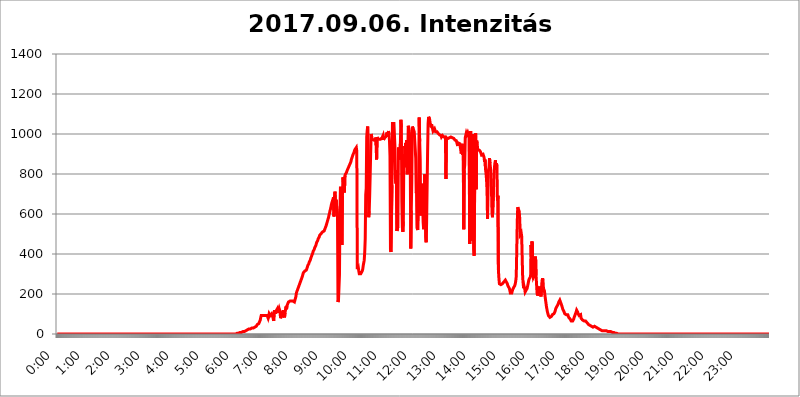
| Category | 2017.09.06. Intenzitás [W/m^2] |
|---|---|
| 0.0 | 0 |
| 0.0006944444444444445 | 0 |
| 0.001388888888888889 | 0 |
| 0.0020833333333333333 | 0 |
| 0.002777777777777778 | 0 |
| 0.003472222222222222 | 0 |
| 0.004166666666666667 | 0 |
| 0.004861111111111111 | 0 |
| 0.005555555555555556 | 0 |
| 0.0062499999999999995 | 0 |
| 0.006944444444444444 | 0 |
| 0.007638888888888889 | 0 |
| 0.008333333333333333 | 0 |
| 0.009027777777777779 | 0 |
| 0.009722222222222222 | 0 |
| 0.010416666666666666 | 0 |
| 0.011111111111111112 | 0 |
| 0.011805555555555555 | 0 |
| 0.012499999999999999 | 0 |
| 0.013194444444444444 | 0 |
| 0.013888888888888888 | 0 |
| 0.014583333333333332 | 0 |
| 0.015277777777777777 | 0 |
| 0.015972222222222224 | 0 |
| 0.016666666666666666 | 0 |
| 0.017361111111111112 | 0 |
| 0.018055555555555557 | 0 |
| 0.01875 | 0 |
| 0.019444444444444445 | 0 |
| 0.02013888888888889 | 0 |
| 0.020833333333333332 | 0 |
| 0.02152777777777778 | 0 |
| 0.022222222222222223 | 0 |
| 0.02291666666666667 | 0 |
| 0.02361111111111111 | 0 |
| 0.024305555555555556 | 0 |
| 0.024999999999999998 | 0 |
| 0.025694444444444447 | 0 |
| 0.02638888888888889 | 0 |
| 0.027083333333333334 | 0 |
| 0.027777777777777776 | 0 |
| 0.02847222222222222 | 0 |
| 0.029166666666666664 | 0 |
| 0.029861111111111113 | 0 |
| 0.030555555555555555 | 0 |
| 0.03125 | 0 |
| 0.03194444444444445 | 0 |
| 0.03263888888888889 | 0 |
| 0.03333333333333333 | 0 |
| 0.034027777777777775 | 0 |
| 0.034722222222222224 | 0 |
| 0.035416666666666666 | 0 |
| 0.036111111111111115 | 0 |
| 0.03680555555555556 | 0 |
| 0.0375 | 0 |
| 0.03819444444444444 | 0 |
| 0.03888888888888889 | 0 |
| 0.03958333333333333 | 0 |
| 0.04027777777777778 | 0 |
| 0.04097222222222222 | 0 |
| 0.041666666666666664 | 0 |
| 0.042361111111111106 | 0 |
| 0.04305555555555556 | 0 |
| 0.043750000000000004 | 0 |
| 0.044444444444444446 | 0 |
| 0.04513888888888889 | 0 |
| 0.04583333333333334 | 0 |
| 0.04652777777777778 | 0 |
| 0.04722222222222222 | 0 |
| 0.04791666666666666 | 0 |
| 0.04861111111111111 | 0 |
| 0.049305555555555554 | 0 |
| 0.049999999999999996 | 0 |
| 0.05069444444444445 | 0 |
| 0.051388888888888894 | 0 |
| 0.052083333333333336 | 0 |
| 0.05277777777777778 | 0 |
| 0.05347222222222222 | 0 |
| 0.05416666666666667 | 0 |
| 0.05486111111111111 | 0 |
| 0.05555555555555555 | 0 |
| 0.05625 | 0 |
| 0.05694444444444444 | 0 |
| 0.057638888888888885 | 0 |
| 0.05833333333333333 | 0 |
| 0.05902777777777778 | 0 |
| 0.059722222222222225 | 0 |
| 0.06041666666666667 | 0 |
| 0.061111111111111116 | 0 |
| 0.06180555555555556 | 0 |
| 0.0625 | 0 |
| 0.06319444444444444 | 0 |
| 0.06388888888888888 | 0 |
| 0.06458333333333334 | 0 |
| 0.06527777777777778 | 0 |
| 0.06597222222222222 | 0 |
| 0.06666666666666667 | 0 |
| 0.06736111111111111 | 0 |
| 0.06805555555555555 | 0 |
| 0.06874999999999999 | 0 |
| 0.06944444444444443 | 0 |
| 0.07013888888888889 | 0 |
| 0.07083333333333333 | 0 |
| 0.07152777777777779 | 0 |
| 0.07222222222222223 | 0 |
| 0.07291666666666667 | 0 |
| 0.07361111111111111 | 0 |
| 0.07430555555555556 | 0 |
| 0.075 | 0 |
| 0.07569444444444444 | 0 |
| 0.0763888888888889 | 0 |
| 0.07708333333333334 | 0 |
| 0.07777777777777778 | 0 |
| 0.07847222222222222 | 0 |
| 0.07916666666666666 | 0 |
| 0.0798611111111111 | 0 |
| 0.08055555555555556 | 0 |
| 0.08125 | 0 |
| 0.08194444444444444 | 0 |
| 0.08263888888888889 | 0 |
| 0.08333333333333333 | 0 |
| 0.08402777777777777 | 0 |
| 0.08472222222222221 | 0 |
| 0.08541666666666665 | 0 |
| 0.08611111111111112 | 0 |
| 0.08680555555555557 | 0 |
| 0.08750000000000001 | 0 |
| 0.08819444444444445 | 0 |
| 0.08888888888888889 | 0 |
| 0.08958333333333333 | 0 |
| 0.09027777777777778 | 0 |
| 0.09097222222222222 | 0 |
| 0.09166666666666667 | 0 |
| 0.09236111111111112 | 0 |
| 0.09305555555555556 | 0 |
| 0.09375 | 0 |
| 0.09444444444444444 | 0 |
| 0.09513888888888888 | 0 |
| 0.09583333333333333 | 0 |
| 0.09652777777777777 | 0 |
| 0.09722222222222222 | 0 |
| 0.09791666666666667 | 0 |
| 0.09861111111111111 | 0 |
| 0.09930555555555555 | 0 |
| 0.09999999999999999 | 0 |
| 0.10069444444444443 | 0 |
| 0.1013888888888889 | 0 |
| 0.10208333333333335 | 0 |
| 0.10277777777777779 | 0 |
| 0.10347222222222223 | 0 |
| 0.10416666666666667 | 0 |
| 0.10486111111111111 | 0 |
| 0.10555555555555556 | 0 |
| 0.10625 | 0 |
| 0.10694444444444444 | 0 |
| 0.1076388888888889 | 0 |
| 0.10833333333333334 | 0 |
| 0.10902777777777778 | 0 |
| 0.10972222222222222 | 0 |
| 0.1111111111111111 | 0 |
| 0.11180555555555556 | 0 |
| 0.11180555555555556 | 0 |
| 0.1125 | 0 |
| 0.11319444444444444 | 0 |
| 0.11388888888888889 | 0 |
| 0.11458333333333333 | 0 |
| 0.11527777777777777 | 0 |
| 0.11597222222222221 | 0 |
| 0.11666666666666665 | 0 |
| 0.1173611111111111 | 0 |
| 0.11805555555555557 | 0 |
| 0.11944444444444445 | 0 |
| 0.12013888888888889 | 0 |
| 0.12083333333333333 | 0 |
| 0.12152777777777778 | 0 |
| 0.12222222222222223 | 0 |
| 0.12291666666666667 | 0 |
| 0.12291666666666667 | 0 |
| 0.12361111111111112 | 0 |
| 0.12430555555555556 | 0 |
| 0.125 | 0 |
| 0.12569444444444444 | 0 |
| 0.12638888888888888 | 0 |
| 0.12708333333333333 | 0 |
| 0.16875 | 0 |
| 0.12847222222222224 | 0 |
| 0.12916666666666668 | 0 |
| 0.12986111111111112 | 0 |
| 0.13055555555555556 | 0 |
| 0.13125 | 0 |
| 0.13194444444444445 | 0 |
| 0.1326388888888889 | 0 |
| 0.13333333333333333 | 0 |
| 0.13402777777777777 | 0 |
| 0.13402777777777777 | 0 |
| 0.13472222222222222 | 0 |
| 0.13541666666666666 | 0 |
| 0.1361111111111111 | 0 |
| 0.13749999999999998 | 0 |
| 0.13819444444444443 | 0 |
| 0.1388888888888889 | 0 |
| 0.13958333333333334 | 0 |
| 0.14027777777777778 | 0 |
| 0.14097222222222222 | 0 |
| 0.14166666666666666 | 0 |
| 0.1423611111111111 | 0 |
| 0.14305555555555557 | 0 |
| 0.14375000000000002 | 0 |
| 0.14444444444444446 | 0 |
| 0.1451388888888889 | 0 |
| 0.1451388888888889 | 0 |
| 0.14652777777777778 | 0 |
| 0.14722222222222223 | 0 |
| 0.14791666666666667 | 0 |
| 0.1486111111111111 | 0 |
| 0.14930555555555555 | 0 |
| 0.15 | 0 |
| 0.15069444444444444 | 0 |
| 0.15138888888888888 | 0 |
| 0.15208333333333332 | 0 |
| 0.15277777777777776 | 0 |
| 0.15347222222222223 | 0 |
| 0.15416666666666667 | 0 |
| 0.15486111111111112 | 0 |
| 0.15555555555555556 | 0 |
| 0.15625 | 0 |
| 0.15694444444444444 | 0 |
| 0.15763888888888888 | 0 |
| 0.15833333333333333 | 0 |
| 0.15902777777777777 | 0 |
| 0.15972222222222224 | 0 |
| 0.16041666666666668 | 0 |
| 0.16111111111111112 | 0 |
| 0.16180555555555556 | 0 |
| 0.1625 | 0 |
| 0.16319444444444445 | 0 |
| 0.1638888888888889 | 0 |
| 0.16458333333333333 | 0 |
| 0.16527777777777777 | 0 |
| 0.16597222222222222 | 0 |
| 0.16666666666666666 | 0 |
| 0.1673611111111111 | 0 |
| 0.16805555555555554 | 0 |
| 0.16874999999999998 | 0 |
| 0.16944444444444443 | 0 |
| 0.17013888888888887 | 0 |
| 0.1708333333333333 | 0 |
| 0.17152777777777775 | 0 |
| 0.17222222222222225 | 0 |
| 0.1729166666666667 | 0 |
| 0.17361111111111113 | 0 |
| 0.17430555555555557 | 0 |
| 0.17500000000000002 | 0 |
| 0.17569444444444446 | 0 |
| 0.1763888888888889 | 0 |
| 0.17708333333333334 | 0 |
| 0.17777777777777778 | 0 |
| 0.17847222222222223 | 0 |
| 0.17916666666666667 | 0 |
| 0.1798611111111111 | 0 |
| 0.18055555555555555 | 0 |
| 0.18125 | 0 |
| 0.18194444444444444 | 0 |
| 0.1826388888888889 | 0 |
| 0.18333333333333335 | 0 |
| 0.1840277777777778 | 0 |
| 0.18472222222222223 | 0 |
| 0.18541666666666667 | 0 |
| 0.18611111111111112 | 0 |
| 0.18680555555555556 | 0 |
| 0.1875 | 0 |
| 0.18819444444444444 | 0 |
| 0.18888888888888888 | 0 |
| 0.18958333333333333 | 0 |
| 0.19027777777777777 | 0 |
| 0.1909722222222222 | 0 |
| 0.19166666666666665 | 0 |
| 0.19236111111111112 | 0 |
| 0.19305555555555554 | 0 |
| 0.19375 | 0 |
| 0.19444444444444445 | 0 |
| 0.1951388888888889 | 0 |
| 0.19583333333333333 | 0 |
| 0.19652777777777777 | 0 |
| 0.19722222222222222 | 0 |
| 0.19791666666666666 | 0 |
| 0.1986111111111111 | 0 |
| 0.19930555555555554 | 0 |
| 0.19999999999999998 | 0 |
| 0.20069444444444443 | 0 |
| 0.20138888888888887 | 0 |
| 0.2020833333333333 | 0 |
| 0.2027777777777778 | 0 |
| 0.2034722222222222 | 0 |
| 0.2041666666666667 | 0 |
| 0.20486111111111113 | 0 |
| 0.20555555555555557 | 0 |
| 0.20625000000000002 | 0 |
| 0.20694444444444446 | 0 |
| 0.2076388888888889 | 0 |
| 0.20833333333333334 | 0 |
| 0.20902777777777778 | 0 |
| 0.20972222222222223 | 0 |
| 0.21041666666666667 | 0 |
| 0.2111111111111111 | 0 |
| 0.21180555555555555 | 0 |
| 0.2125 | 0 |
| 0.21319444444444444 | 0 |
| 0.2138888888888889 | 0 |
| 0.21458333333333335 | 0 |
| 0.2152777777777778 | 0 |
| 0.21597222222222223 | 0 |
| 0.21666666666666667 | 0 |
| 0.21736111111111112 | 0 |
| 0.21805555555555556 | 0 |
| 0.21875 | 0 |
| 0.21944444444444444 | 0 |
| 0.22013888888888888 | 0 |
| 0.22083333333333333 | 0 |
| 0.22152777777777777 | 0 |
| 0.2222222222222222 | 0 |
| 0.22291666666666665 | 0 |
| 0.2236111111111111 | 0 |
| 0.22430555555555556 | 0 |
| 0.225 | 0 |
| 0.22569444444444445 | 0 |
| 0.2263888888888889 | 0 |
| 0.22708333333333333 | 0 |
| 0.22777777777777777 | 0 |
| 0.22847222222222222 | 0 |
| 0.22916666666666666 | 0 |
| 0.2298611111111111 | 0 |
| 0.23055555555555554 | 0 |
| 0.23124999999999998 | 0 |
| 0.23194444444444443 | 0 |
| 0.23263888888888887 | 0 |
| 0.2333333333333333 | 0 |
| 0.2340277777777778 | 0 |
| 0.2347222222222222 | 0 |
| 0.2354166666666667 | 0 |
| 0.23611111111111113 | 0 |
| 0.23680555555555557 | 0 |
| 0.23750000000000002 | 0 |
| 0.23819444444444446 | 0 |
| 0.2388888888888889 | 0 |
| 0.23958333333333334 | 0 |
| 0.24027777777777778 | 0 |
| 0.24097222222222223 | 0 |
| 0.24166666666666667 | 0 |
| 0.2423611111111111 | 0 |
| 0.24305555555555555 | 0 |
| 0.24375 | 0 |
| 0.24444444444444446 | 0 |
| 0.24513888888888888 | 0 |
| 0.24583333333333335 | 0 |
| 0.2465277777777778 | 0 |
| 0.24722222222222223 | 0 |
| 0.24791666666666667 | 0 |
| 0.24861111111111112 | 0 |
| 0.24930555555555556 | 0 |
| 0.25 | 0 |
| 0.25069444444444444 | 3.525 |
| 0.2513888888888889 | 3.525 |
| 0.2520833333333333 | 3.525 |
| 0.25277777777777777 | 3.525 |
| 0.2534722222222222 | 3.525 |
| 0.25416666666666665 | 3.525 |
| 0.2548611111111111 | 3.525 |
| 0.2555555555555556 | 3.525 |
| 0.25625000000000003 | 7.887 |
| 0.2569444444444445 | 7.887 |
| 0.2576388888888889 | 7.887 |
| 0.25833333333333336 | 7.887 |
| 0.2590277777777778 | 7.887 |
| 0.25972222222222224 | 12.257 |
| 0.2604166666666667 | 12.257 |
| 0.2611111111111111 | 12.257 |
| 0.26180555555555557 | 12.257 |
| 0.2625 | 12.257 |
| 0.26319444444444445 | 16.636 |
| 0.2638888888888889 | 16.636 |
| 0.26458333333333334 | 16.636 |
| 0.2652777777777778 | 21.024 |
| 0.2659722222222222 | 21.024 |
| 0.26666666666666666 | 21.024 |
| 0.2673611111111111 | 21.024 |
| 0.26805555555555555 | 25.419 |
| 0.26875 | 25.419 |
| 0.26944444444444443 | 25.419 |
| 0.2701388888888889 | 25.419 |
| 0.2708333333333333 | 25.419 |
| 0.27152777777777776 | 25.419 |
| 0.2722222222222222 | 29.823 |
| 0.27291666666666664 | 29.823 |
| 0.2736111111111111 | 29.823 |
| 0.2743055555555555 | 29.823 |
| 0.27499999999999997 | 29.823 |
| 0.27569444444444446 | 34.234 |
| 0.27638888888888885 | 34.234 |
| 0.27708333333333335 | 34.234 |
| 0.2777777777777778 | 38.653 |
| 0.27847222222222223 | 38.653 |
| 0.2791666666666667 | 38.653 |
| 0.2798611111111111 | 43.079 |
| 0.28055555555555556 | 47.511 |
| 0.28125 | 47.511 |
| 0.28194444444444444 | 47.511 |
| 0.2826388888888889 | 51.951 |
| 0.2833333333333333 | 56.398 |
| 0.28402777777777777 | 56.398 |
| 0.2847222222222222 | 69.775 |
| 0.28541666666666665 | 83.205 |
| 0.28611111111111115 | 92.184 |
| 0.28680555555555554 | 92.184 |
| 0.28750000000000003 | 92.184 |
| 0.2881944444444445 | 92.184 |
| 0.2888888888888889 | 92.184 |
| 0.28958333333333336 | 92.184 |
| 0.2902777777777778 | 92.184 |
| 0.29097222222222224 | 92.184 |
| 0.2916666666666667 | 92.184 |
| 0.2923611111111111 | 92.184 |
| 0.29305555555555557 | 92.184 |
| 0.29375 | 92.184 |
| 0.29444444444444445 | 92.184 |
| 0.2951388888888889 | 92.184 |
| 0.29583333333333334 | 78.722 |
| 0.2965277777777778 | 87.692 |
| 0.2972222222222222 | 101.184 |
| 0.29791666666666666 | 96.682 |
| 0.2986111111111111 | 92.184 |
| 0.29930555555555555 | 92.184 |
| 0.3 | 87.692 |
| 0.30069444444444443 | 101.184 |
| 0.3013888888888889 | 101.184 |
| 0.3020833333333333 | 101.184 |
| 0.30277777777777776 | 78.722 |
| 0.3034722222222222 | 65.31 |
| 0.30416666666666664 | 101.184 |
| 0.3048611111111111 | 119.235 |
| 0.3055555555555555 | 123.758 |
| 0.30624999999999997 | 101.184 |
| 0.3069444444444444 | 114.716 |
| 0.3076388888888889 | 114.716 |
| 0.30833333333333335 | 123.758 |
| 0.3090277777777778 | 105.69 |
| 0.30972222222222223 | 110.201 |
| 0.3104166666666667 | 105.69 |
| 0.3111111111111111 | 128.284 |
| 0.31180555555555556 | 128.284 |
| 0.3125 | 110.201 |
| 0.31319444444444444 | 78.722 |
| 0.3138888888888889 | 83.205 |
| 0.3145833333333333 | 96.682 |
| 0.31527777777777777 | 96.682 |
| 0.3159722222222222 | 83.205 |
| 0.31666666666666665 | 101.184 |
| 0.31736111111111115 | 119.235 |
| 0.31805555555555554 | 119.235 |
| 0.31875000000000003 | 83.205 |
| 0.3194444444444445 | 105.69 |
| 0.3201388888888889 | 101.184 |
| 0.32083333333333336 | 137.347 |
| 0.3215277777777778 | 123.758 |
| 0.32222222222222224 | 141.884 |
| 0.3229166666666667 | 137.347 |
| 0.3236111111111111 | 146.423 |
| 0.32430555555555557 | 160.056 |
| 0.325 | 160.056 |
| 0.32569444444444445 | 164.605 |
| 0.3263888888888889 | 164.605 |
| 0.32708333333333334 | 164.605 |
| 0.3277777777777778 | 164.605 |
| 0.3284722222222222 | 164.605 |
| 0.32916666666666666 | 169.156 |
| 0.3298611111111111 | 164.605 |
| 0.33055555555555555 | 164.605 |
| 0.33125 | 160.056 |
| 0.33194444444444443 | 160.056 |
| 0.3326388888888889 | 160.056 |
| 0.3333333333333333 | 160.056 |
| 0.3340277777777778 | 164.605 |
| 0.3347222222222222 | 187.378 |
| 0.3354166666666667 | 205.62 |
| 0.3361111111111111 | 210.182 |
| 0.3368055555555556 | 219.309 |
| 0.33749999999999997 | 223.873 |
| 0.33819444444444446 | 233 |
| 0.33888888888888885 | 237.564 |
| 0.33958333333333335 | 246.689 |
| 0.34027777777777773 | 251.251 |
| 0.34097222222222223 | 260.373 |
| 0.3416666666666666 | 264.932 |
| 0.3423611111111111 | 274.047 |
| 0.3430555555555555 | 278.603 |
| 0.34375 | 287.709 |
| 0.3444444444444445 | 296.808 |
| 0.3451388888888889 | 305.898 |
| 0.3458333333333334 | 305.898 |
| 0.34652777777777777 | 310.44 |
| 0.34722222222222227 | 314.98 |
| 0.34791666666666665 | 314.98 |
| 0.34861111111111115 | 319.517 |
| 0.34930555555555554 | 319.517 |
| 0.35000000000000003 | 324.052 |
| 0.3506944444444444 | 333.113 |
| 0.3513888888888889 | 342.162 |
| 0.3520833333333333 | 346.682 |
| 0.3527777777777778 | 351.198 |
| 0.3534722222222222 | 360.221 |
| 0.3541666666666667 | 364.728 |
| 0.3548611111111111 | 369.23 |
| 0.35555555555555557 | 378.224 |
| 0.35625 | 382.715 |
| 0.35694444444444445 | 391.685 |
| 0.3576388888888889 | 396.164 |
| 0.35833333333333334 | 405.108 |
| 0.3590277777777778 | 414.035 |
| 0.3597222222222222 | 418.492 |
| 0.36041666666666666 | 422.943 |
| 0.3611111111111111 | 431.833 |
| 0.36180555555555555 | 436.27 |
| 0.3625 | 440.702 |
| 0.36319444444444443 | 449.551 |
| 0.3638888888888889 | 458.38 |
| 0.3645833333333333 | 462.786 |
| 0.3652777777777778 | 467.187 |
| 0.3659722222222222 | 475.972 |
| 0.3666666666666667 | 480.356 |
| 0.3673611111111111 | 484.735 |
| 0.3680555555555556 | 493.475 |
| 0.36874999999999997 | 497.836 |
| 0.36944444444444446 | 497.836 |
| 0.37013888888888885 | 502.192 |
| 0.37083333333333335 | 502.192 |
| 0.37152777777777773 | 506.542 |
| 0.37222222222222223 | 510.885 |
| 0.3729166666666666 | 515.223 |
| 0.3736111111111111 | 515.223 |
| 0.3743055555555555 | 515.223 |
| 0.375 | 519.555 |
| 0.3756944444444445 | 528.2 |
| 0.3763888888888889 | 532.513 |
| 0.3770833333333334 | 541.121 |
| 0.37777777777777777 | 545.416 |
| 0.37847222222222227 | 558.261 |
| 0.37916666666666665 | 566.793 |
| 0.37986111111111115 | 575.299 |
| 0.38055555555555554 | 583.779 |
| 0.38125000000000003 | 596.45 |
| 0.3819444444444444 | 604.864 |
| 0.3826388888888889 | 617.436 |
| 0.3833333333333333 | 625.784 |
| 0.3840277777777778 | 638.256 |
| 0.3847222222222222 | 650.667 |
| 0.3854166666666667 | 658.909 |
| 0.3861111111111111 | 667.123 |
| 0.38680555555555557 | 675.311 |
| 0.3875 | 683.473 |
| 0.38819444444444445 | 588.009 |
| 0.3888888888888889 | 687.544 |
| 0.38958333333333334 | 711.832 |
| 0.3902777777777778 | 625.784 |
| 0.3909722222222222 | 671.22 |
| 0.39166666666666666 | 671.22 |
| 0.3923611111111111 | 675.311 |
| 0.39305555555555555 | 592.233 |
| 0.39375 | 160.056 |
| 0.39444444444444443 | 169.156 |
| 0.3951388888888889 | 233 |
| 0.3958333333333333 | 296.808 |
| 0.3965277777777778 | 617.436 |
| 0.3972222222222222 | 735.89 |
| 0.3979166666666667 | 663.019 |
| 0.3986111111111111 | 583.779 |
| 0.3993055555555556 | 445.129 |
| 0.39999999999999997 | 691.608 |
| 0.40069444444444446 | 783.342 |
| 0.40138888888888885 | 755.766 |
| 0.40208333333333335 | 735.89 |
| 0.40277777777777773 | 707.8 |
| 0.40347222222222223 | 791.169 |
| 0.4041666666666666 | 798.974 |
| 0.4048611111111111 | 798.974 |
| 0.4055555555555555 | 806.757 |
| 0.40625 | 814.519 |
| 0.4069444444444445 | 818.392 |
| 0.4076388888888889 | 826.123 |
| 0.4083333333333334 | 829.981 |
| 0.40902777777777777 | 837.682 |
| 0.40972222222222227 | 841.526 |
| 0.41041666666666665 | 849.199 |
| 0.41111111111111115 | 853.029 |
| 0.41180555555555554 | 860.676 |
| 0.41250000000000003 | 872.114 |
| 0.4131944444444444 | 879.719 |
| 0.4138888888888889 | 887.309 |
| 0.4145833333333333 | 894.885 |
| 0.4152777777777778 | 898.668 |
| 0.4159722222222222 | 906.223 |
| 0.4166666666666667 | 909.996 |
| 0.4173611111111111 | 921.298 |
| 0.41805555555555557 | 925.06 |
| 0.41875 | 925.06 |
| 0.41944444444444445 | 932.576 |
| 0.4201388888888889 | 913.766 |
| 0.42083333333333334 | 324.052 |
| 0.4215277777777778 | 319.517 |
| 0.4222222222222222 | 333.113 |
| 0.42291666666666666 | 314.98 |
| 0.4236111111111111 | 301.354 |
| 0.42430555555555555 | 296.808 |
| 0.425 | 296.808 |
| 0.42569444444444443 | 301.354 |
| 0.4263888888888889 | 301.354 |
| 0.4270833333333333 | 305.898 |
| 0.4277777777777778 | 314.98 |
| 0.4284722222222222 | 324.052 |
| 0.4291666666666667 | 342.162 |
| 0.4298611111111111 | 355.712 |
| 0.4305555555555556 | 369.23 |
| 0.43124999999999997 | 409.574 |
| 0.43194444444444446 | 475.972 |
| 0.43263888888888885 | 695.666 |
| 0.43333333333333335 | 727.896 |
| 0.43402777777777773 | 984.98 |
| 0.43472222222222223 | 1018.587 |
| 0.4354166666666666 | 1037.277 |
| 0.4361111111111111 | 833.834 |
| 0.4368055555555555 | 583.779 |
| 0.4375 | 613.252 |
| 0.4381944444444445 | 691.608 |
| 0.4388888888888889 | 791.169 |
| 0.4395833333333334 | 906.223 |
| 0.44027777777777777 | 999.916 |
| 0.44097222222222227 | 988.714 |
| 0.44166666666666665 | 973.772 |
| 0.44236111111111115 | 973.772 |
| 0.44305555555555554 | 970.034 |
| 0.44375000000000003 | 970.034 |
| 0.4444444444444444 | 970.034 |
| 0.4451388888888889 | 973.772 |
| 0.4458333333333333 | 973.772 |
| 0.4465277777777778 | 981.244 |
| 0.4472222222222222 | 943.832 |
| 0.4479166666666667 | 872.114 |
| 0.4486111111111111 | 984.98 |
| 0.44930555555555557 | 977.508 |
| 0.45 | 977.508 |
| 0.45069444444444445 | 977.508 |
| 0.4513888888888889 | 973.772 |
| 0.45208333333333334 | 973.772 |
| 0.4527777777777778 | 973.772 |
| 0.4534722222222222 | 973.772 |
| 0.45416666666666666 | 977.508 |
| 0.4548611111111111 | 977.508 |
| 0.45555555555555555 | 981.244 |
| 0.45625 | 984.98 |
| 0.45694444444444443 | 992.448 |
| 0.4576388888888889 | 970.034 |
| 0.4583333333333333 | 977.508 |
| 0.4590277777777778 | 973.772 |
| 0.4597222222222222 | 977.508 |
| 0.4604166666666667 | 984.98 |
| 0.4611111111111111 | 992.448 |
| 0.4618055555555556 | 999.916 |
| 0.46249999999999997 | 1007.383 |
| 0.46319444444444446 | 984.98 |
| 0.46388888888888885 | 988.714 |
| 0.46458333333333335 | 1014.852 |
| 0.46527777777777773 | 996.182 |
| 0.46597222222222223 | 966.295 |
| 0.4666666666666666 | 891.099 |
| 0.4673611111111111 | 422.943 |
| 0.4680555555555555 | 409.574 |
| 0.46875 | 414.035 |
| 0.4694444444444445 | 743.859 |
| 0.4701388888888889 | 1052.255 |
| 0.4708333333333334 | 1052.255 |
| 0.47152777777777777 | 1056.004 |
| 0.47222222222222227 | 1052.255 |
| 0.47291666666666665 | 1048.508 |
| 0.47361111111111115 | 936.33 |
| 0.47430555555555554 | 775.492 |
| 0.47500000000000003 | 751.803 |
| 0.4756944444444444 | 818.392 |
| 0.4763888888888889 | 515.223 |
| 0.4770833333333333 | 519.555 |
| 0.4777777777777778 | 536.82 |
| 0.4784722222222222 | 932.576 |
| 0.4791666666666667 | 932.576 |
| 0.4798611111111111 | 928.819 |
| 0.48055555555555557 | 872.114 |
| 0.48125 | 951.327 |
| 0.48194444444444445 | 1071.027 |
| 0.4826388888888889 | 1033.537 |
| 0.48333333333333334 | 658.909 |
| 0.4840277777777778 | 532.513 |
| 0.4847222222222222 | 510.885 |
| 0.48541666666666666 | 562.53 |
| 0.4861111111111111 | 898.668 |
| 0.48680555555555555 | 833.834 |
| 0.4875 | 940.082 |
| 0.48819444444444443 | 928.819 |
| 0.4888888888888889 | 955.071 |
| 0.4895833333333333 | 913.766 |
| 0.4902777777777778 | 970.034 |
| 0.4909722222222222 | 798.974 |
| 0.4916666666666667 | 917.534 |
| 0.4923611111111111 | 1041.019 |
| 0.4930555555555556 | 1037.277 |
| 0.49374999999999997 | 1037.277 |
| 0.49444444444444446 | 984.98 |
| 0.49513888888888885 | 845.365 |
| 0.49583333333333335 | 427.39 |
| 0.49652777777777773 | 617.436 |
| 0.49722222222222223 | 755.766 |
| 0.4979166666666666 | 1037.277 |
| 0.4986111111111111 | 1037.277 |
| 0.4993055555555555 | 1026.06 |
| 0.5 | 1022.323 |
| 0.5006944444444444 | 1011.118 |
| 0.5013888888888889 | 1007.383 |
| 0.5020833333333333 | 1014.852 |
| 0.5027777777777778 | 879.719 |
| 0.5034722222222222 | 703.762 |
| 0.5041666666666667 | 711.832 |
| 0.5048611111111111 | 528.2 |
| 0.5055555555555555 | 519.555 |
| 0.50625 | 650.667 |
| 0.5069444444444444 | 802.868 |
| 0.5076388888888889 | 1082.324 |
| 0.5083333333333333 | 962.555 |
| 0.5090277777777777 | 875.918 |
| 0.5097222222222222 | 592.233 |
| 0.5104166666666666 | 675.311 |
| 0.5111111111111112 | 675.311 |
| 0.5118055555555555 | 751.803 |
| 0.5125000000000001 | 646.537 |
| 0.5131944444444444 | 558.261 |
| 0.513888888888889 | 523.88 |
| 0.5145833333333333 | 566.793 |
| 0.5152777777777778 | 798.974 |
| 0.5159722222222222 | 703.762 |
| 0.5166666666666667 | 484.735 |
| 0.517361111111111 | 458.38 |
| 0.5180555555555556 | 558.261 |
| 0.5187499999999999 | 558.261 |
| 0.5194444444444445 | 913.766 |
| 0.5201388888888888 | 1052.255 |
| 0.5208333333333334 | 1086.097 |
| 0.5215277777777778 | 1086.097 |
| 0.5222222222222223 | 1074.789 |
| 0.5229166666666667 | 1056.004 |
| 0.5236111111111111 | 1048.508 |
| 0.5243055555555556 | 1033.537 |
| 0.525 | 1048.508 |
| 0.5256944444444445 | 1033.537 |
| 0.5263888888888889 | 1026.06 |
| 0.5270833333333333 | 1014.852 |
| 0.5277777777777778 | 1011.118 |
| 0.5284722222222222 | 1018.587 |
| 0.5291666666666667 | 1026.06 |
| 0.5298611111111111 | 1018.587 |
| 0.5305555555555556 | 1011.118 |
| 0.53125 | 1014.852 |
| 0.5319444444444444 | 1011.118 |
| 0.5326388888888889 | 1011.118 |
| 0.5333333333333333 | 1007.383 |
| 0.5340277777777778 | 1003.65 |
| 0.5347222222222222 | 1003.65 |
| 0.5354166666666667 | 1003.65 |
| 0.5361111111111111 | 996.182 |
| 0.5368055555555555 | 999.916 |
| 0.5375 | 996.182 |
| 0.5381944444444444 | 992.448 |
| 0.5388888888888889 | 984.98 |
| 0.5395833333333333 | 988.714 |
| 0.5402777777777777 | 992.448 |
| 0.5409722222222222 | 992.448 |
| 0.5416666666666666 | 988.714 |
| 0.5423611111111112 | 984.98 |
| 0.5430555555555555 | 988.714 |
| 0.5437500000000001 | 988.714 |
| 0.5444444444444444 | 984.98 |
| 0.545138888888889 | 775.492 |
| 0.5458333333333333 | 981.244 |
| 0.5465277777777778 | 984.98 |
| 0.5472222222222222 | 984.98 |
| 0.5479166666666667 | 977.508 |
| 0.548611111111111 | 977.508 |
| 0.5493055555555556 | 981.244 |
| 0.5499999999999999 | 981.244 |
| 0.5506944444444445 | 981.244 |
| 0.5513888888888888 | 981.244 |
| 0.5520833333333334 | 984.98 |
| 0.5527777777777778 | 984.98 |
| 0.5534722222222223 | 981.244 |
| 0.5541666666666667 | 981.244 |
| 0.5548611111111111 | 977.508 |
| 0.5555555555555556 | 977.508 |
| 0.55625 | 977.508 |
| 0.5569444444444445 | 973.772 |
| 0.5576388888888889 | 970.034 |
| 0.5583333333333333 | 973.772 |
| 0.5590277777777778 | 970.034 |
| 0.5597222222222222 | 966.295 |
| 0.5604166666666667 | 962.555 |
| 0.5611111111111111 | 947.58 |
| 0.5618055555555556 | 940.082 |
| 0.5625 | 955.071 |
| 0.5631944444444444 | 955.071 |
| 0.5638888888888889 | 955.071 |
| 0.5645833333333333 | 951.327 |
| 0.5652777777777778 | 955.071 |
| 0.5659722222222222 | 947.58 |
| 0.5666666666666667 | 902.447 |
| 0.5673611111111111 | 928.819 |
| 0.5680555555555555 | 951.327 |
| 0.56875 | 894.885 |
| 0.5694444444444444 | 940.082 |
| 0.5701388888888889 | 523.88 |
| 0.5708333333333333 | 818.392 |
| 0.5715277777777777 | 845.365 |
| 0.5722222222222222 | 981.244 |
| 0.5729166666666666 | 984.98 |
| 0.5736111111111112 | 1003.65 |
| 0.5743055555555555 | 996.182 |
| 0.5750000000000001 | 996.182 |
| 0.5756944444444444 | 1007.383 |
| 0.576388888888889 | 1003.65 |
| 0.5770833333333333 | 992.448 |
| 0.5777777777777778 | 1003.65 |
| 0.5784722222222222 | 449.551 |
| 0.5791666666666667 | 984.98 |
| 0.579861111111111 | 1014.852 |
| 0.5805555555555556 | 467.187 |
| 0.5812499999999999 | 613.252 |
| 0.5819444444444445 | 475.972 |
| 0.5826388888888888 | 999.916 |
| 0.5833333333333334 | 671.22 |
| 0.5840277777777778 | 422.943 |
| 0.5847222222222223 | 391.685 |
| 0.5854166666666667 | 739.877 |
| 0.5861111111111111 | 829.981 |
| 0.5868055555555556 | 1003.65 |
| 0.5875 | 723.889 |
| 0.5881944444444445 | 966.295 |
| 0.5888888888888889 | 951.327 |
| 0.5895833333333333 | 928.819 |
| 0.5902777777777778 | 921.298 |
| 0.5909722222222222 | 925.06 |
| 0.5916666666666667 | 925.06 |
| 0.5923611111111111 | 917.534 |
| 0.5930555555555556 | 921.298 |
| 0.59375 | 909.996 |
| 0.5944444444444444 | 906.223 |
| 0.5951388888888889 | 894.885 |
| 0.5958333333333333 | 898.668 |
| 0.5965277777777778 | 894.885 |
| 0.5972222222222222 | 898.668 |
| 0.5979166666666667 | 898.668 |
| 0.5986111111111111 | 883.516 |
| 0.5993055555555555 | 860.676 |
| 0.6 | 872.114 |
| 0.6006944444444444 | 822.26 |
| 0.6013888888888889 | 802.868 |
| 0.6020833333333333 | 771.559 |
| 0.6027777777777777 | 719.877 |
| 0.6034722222222222 | 575.299 |
| 0.6041666666666666 | 806.757 |
| 0.6048611111111112 | 806.757 |
| 0.6055555555555555 | 833.834 |
| 0.6062500000000001 | 879.719 |
| 0.6069444444444444 | 853.029 |
| 0.607638888888889 | 829.981 |
| 0.6083333333333333 | 798.974 |
| 0.6090277777777778 | 719.877 |
| 0.6097222222222222 | 609.062 |
| 0.6104166666666667 | 583.779 |
| 0.611111111111111 | 583.779 |
| 0.6118055555555556 | 707.8 |
| 0.6124999999999999 | 791.169 |
| 0.6131944444444445 | 833.834 |
| 0.6138888888888888 | 856.855 |
| 0.6145833333333334 | 868.305 |
| 0.6152777777777778 | 822.26 |
| 0.6159722222222223 | 853.029 |
| 0.6166666666666667 | 841.526 |
| 0.6173611111111111 | 667.123 |
| 0.6180555555555556 | 691.608 |
| 0.61875 | 319.517 |
| 0.6194444444444445 | 278.603 |
| 0.6201388888888889 | 251.251 |
| 0.6208333333333333 | 246.689 |
| 0.6215277777777778 | 246.689 |
| 0.6222222222222222 | 246.689 |
| 0.6229166666666667 | 246.689 |
| 0.6236111111111111 | 251.251 |
| 0.6243055555555556 | 251.251 |
| 0.625 | 255.813 |
| 0.6256944444444444 | 251.251 |
| 0.6263888888888889 | 260.373 |
| 0.6270833333333333 | 260.373 |
| 0.6277777777777778 | 264.932 |
| 0.6284722222222222 | 269.49 |
| 0.6291666666666667 | 264.932 |
| 0.6298611111111111 | 260.373 |
| 0.6305555555555555 | 255.813 |
| 0.63125 | 251.251 |
| 0.6319444444444444 | 242.127 |
| 0.6326388888888889 | 242.127 |
| 0.6333333333333333 | 237.564 |
| 0.6340277777777777 | 228.436 |
| 0.6347222222222222 | 219.309 |
| 0.6354166666666666 | 205.62 |
| 0.6361111111111112 | 201.058 |
| 0.6368055555555555 | 201.058 |
| 0.6375000000000001 | 205.62 |
| 0.6381944444444444 | 214.746 |
| 0.638888888888889 | 223.873 |
| 0.6395833333333333 | 228.436 |
| 0.6402777777777778 | 233 |
| 0.6409722222222222 | 237.564 |
| 0.6416666666666667 | 242.127 |
| 0.642361111111111 | 251.251 |
| 0.6430555555555556 | 264.932 |
| 0.6437499999999999 | 287.709 |
| 0.6444444444444445 | 409.574 |
| 0.6451388888888888 | 553.986 |
| 0.6458333333333334 | 634.105 |
| 0.6465277777777778 | 625.784 |
| 0.6472222222222223 | 625.784 |
| 0.6479166666666667 | 613.252 |
| 0.6486111111111111 | 579.542 |
| 0.6493055555555556 | 497.836 |
| 0.65 | 502.192 |
| 0.6506944444444445 | 506.542 |
| 0.6513888888888889 | 489.108 |
| 0.6520833333333333 | 382.715 |
| 0.6527777777777778 | 283.156 |
| 0.6534722222222222 | 251.251 |
| 0.6541666666666667 | 228.436 |
| 0.6548611111111111 | 237.564 |
| 0.6555555555555556 | 228.436 |
| 0.65625 | 210.182 |
| 0.6569444444444444 | 214.746 |
| 0.6576388888888889 | 219.309 |
| 0.6583333333333333 | 223.873 |
| 0.6590277777777778 | 228.436 |
| 0.6597222222222222 | 233 |
| 0.6604166666666667 | 251.251 |
| 0.6611111111111111 | 264.932 |
| 0.6618055555555555 | 274.047 |
| 0.6625 | 278.603 |
| 0.6631944444444444 | 278.603 |
| 0.6638888888888889 | 287.709 |
| 0.6645833333333333 | 445.129 |
| 0.6652777777777777 | 342.162 |
| 0.6659722222222222 | 462.786 |
| 0.6666666666666666 | 387.202 |
| 0.6673611111111111 | 378.224 |
| 0.6680555555555556 | 283.156 |
| 0.6687500000000001 | 283.156 |
| 0.6694444444444444 | 292.259 |
| 0.6701388888888888 | 360.221 |
| 0.6708333333333334 | 387.202 |
| 0.6715277777777778 | 292.259 |
| 0.6722222222222222 | 251.251 |
| 0.6729166666666666 | 205.62 |
| 0.6736111111111112 | 191.937 |
| 0.6743055555555556 | 191.937 |
| 0.6749999999999999 | 196.497 |
| 0.6756944444444444 | 214.746 |
| 0.6763888888888889 | 237.564 |
| 0.6770833333333334 | 210.182 |
| 0.6777777777777777 | 210.182 |
| 0.6784722222222223 | 187.378 |
| 0.6791666666666667 | 191.937 |
| 0.6798611111111111 | 187.378 |
| 0.6805555555555555 | 278.603 |
| 0.68125 | 269.49 |
| 0.6819444444444445 | 228.436 |
| 0.6826388888888889 | 223.873 |
| 0.6833333333333332 | 214.746 |
| 0.6840277777777778 | 191.937 |
| 0.6847222222222222 | 173.709 |
| 0.6854166666666667 | 155.509 |
| 0.686111111111111 | 137.347 |
| 0.6868055555555556 | 123.758 |
| 0.6875 | 110.201 |
| 0.6881944444444444 | 101.184 |
| 0.688888888888889 | 92.184 |
| 0.6895833333333333 | 92.184 |
| 0.6902777777777778 | 87.692 |
| 0.6909722222222222 | 83.205 |
| 0.6916666666666668 | 83.205 |
| 0.6923611111111111 | 87.692 |
| 0.6930555555555555 | 87.692 |
| 0.69375 | 92.184 |
| 0.6944444444444445 | 96.682 |
| 0.6951388888888889 | 101.184 |
| 0.6958333333333333 | 101.184 |
| 0.6965277777777777 | 101.184 |
| 0.6972222222222223 | 105.69 |
| 0.6979166666666666 | 110.201 |
| 0.6986111111111111 | 119.235 |
| 0.6993055555555556 | 128.284 |
| 0.7000000000000001 | 132.814 |
| 0.7006944444444444 | 137.347 |
| 0.7013888888888888 | 141.884 |
| 0.7020833333333334 | 146.423 |
| 0.7027777777777778 | 150.964 |
| 0.7034722222222222 | 160.056 |
| 0.7041666666666666 | 164.605 |
| 0.7048611111111112 | 169.156 |
| 0.7055555555555556 | 164.605 |
| 0.7062499999999999 | 155.509 |
| 0.7069444444444444 | 150.964 |
| 0.7076388888888889 | 141.884 |
| 0.7083333333333334 | 132.814 |
| 0.7090277777777777 | 123.758 |
| 0.7097222222222223 | 119.235 |
| 0.7104166666666667 | 114.716 |
| 0.7111111111111111 | 110.201 |
| 0.7118055555555555 | 101.184 |
| 0.7125 | 96.682 |
| 0.7131944444444445 | 96.682 |
| 0.7138888888888889 | 96.682 |
| 0.7145833333333332 | 96.682 |
| 0.7152777777777778 | 96.682 |
| 0.7159722222222222 | 96.682 |
| 0.7166666666666667 | 92.184 |
| 0.717361111111111 | 83.205 |
| 0.7180555555555556 | 83.205 |
| 0.71875 | 78.722 |
| 0.7194444444444444 | 74.246 |
| 0.720138888888889 | 69.775 |
| 0.7208333333333333 | 65.31 |
| 0.7215277777777778 | 65.31 |
| 0.7222222222222222 | 65.31 |
| 0.7229166666666668 | 65.31 |
| 0.7236111111111111 | 69.775 |
| 0.7243055555555555 | 74.246 |
| 0.725 | 83.205 |
| 0.7256944444444445 | 87.692 |
| 0.7263888888888889 | 96.682 |
| 0.7270833333333333 | 101.184 |
| 0.7277777777777777 | 110.201 |
| 0.7284722222222223 | 119.235 |
| 0.7291666666666666 | 123.758 |
| 0.7298611111111111 | 110.201 |
| 0.7305555555555556 | 101.184 |
| 0.7312500000000001 | 96.682 |
| 0.7319444444444444 | 92.184 |
| 0.7326388888888888 | 87.692 |
| 0.7333333333333334 | 96.682 |
| 0.7340277777777778 | 96.682 |
| 0.7347222222222222 | 78.722 |
| 0.7354166666666666 | 78.722 |
| 0.7361111111111112 | 74.246 |
| 0.7368055555555556 | 69.775 |
| 0.7374999999999999 | 69.775 |
| 0.7381944444444444 | 69.775 |
| 0.7388888888888889 | 65.31 |
| 0.7395833333333334 | 65.31 |
| 0.7402777777777777 | 65.31 |
| 0.7409722222222223 | 65.31 |
| 0.7416666666666667 | 60.85 |
| 0.7423611111111111 | 60.85 |
| 0.7430555555555555 | 56.398 |
| 0.74375 | 56.398 |
| 0.7444444444444445 | 51.951 |
| 0.7451388888888889 | 47.511 |
| 0.7458333333333332 | 47.511 |
| 0.7465277777777778 | 43.079 |
| 0.7472222222222222 | 43.079 |
| 0.7479166666666667 | 38.653 |
| 0.748611111111111 | 38.653 |
| 0.7493055555555556 | 38.653 |
| 0.75 | 38.653 |
| 0.7506944444444444 | 38.653 |
| 0.751388888888889 | 34.234 |
| 0.7520833333333333 | 34.234 |
| 0.7527777777777778 | 34.234 |
| 0.7534722222222222 | 38.653 |
| 0.7541666666666668 | 34.234 |
| 0.7548611111111111 | 34.234 |
| 0.7555555555555555 | 34.234 |
| 0.75625 | 34.234 |
| 0.7569444444444445 | 29.823 |
| 0.7576388888888889 | 29.823 |
| 0.7583333333333333 | 25.419 |
| 0.7590277777777777 | 25.419 |
| 0.7597222222222223 | 25.419 |
| 0.7604166666666666 | 21.024 |
| 0.7611111111111111 | 21.024 |
| 0.7618055555555556 | 21.024 |
| 0.7625000000000001 | 21.024 |
| 0.7631944444444444 | 16.636 |
| 0.7638888888888888 | 16.636 |
| 0.7645833333333334 | 16.636 |
| 0.7652777777777778 | 16.636 |
| 0.7659722222222222 | 16.636 |
| 0.7666666666666666 | 16.636 |
| 0.7673611111111112 | 16.636 |
| 0.7680555555555556 | 16.636 |
| 0.7687499999999999 | 16.636 |
| 0.7694444444444444 | 16.636 |
| 0.7701388888888889 | 16.636 |
| 0.7708333333333334 | 16.636 |
| 0.7715277777777777 | 16.636 |
| 0.7722222222222223 | 12.257 |
| 0.7729166666666667 | 12.257 |
| 0.7736111111111111 | 12.257 |
| 0.7743055555555555 | 12.257 |
| 0.775 | 12.257 |
| 0.7756944444444445 | 12.257 |
| 0.7763888888888889 | 12.257 |
| 0.7770833333333332 | 12.257 |
| 0.7777777777777778 | 7.887 |
| 0.7784722222222222 | 7.887 |
| 0.7791666666666667 | 7.887 |
| 0.779861111111111 | 7.887 |
| 0.7805555555555556 | 7.887 |
| 0.78125 | 3.525 |
| 0.7819444444444444 | 3.525 |
| 0.782638888888889 | 3.525 |
| 0.7833333333333333 | 3.525 |
| 0.7840277777777778 | 3.525 |
| 0.7847222222222222 | 3.525 |
| 0.7854166666666668 | 0 |
| 0.7861111111111111 | 0 |
| 0.7868055555555555 | 0 |
| 0.7875 | 0 |
| 0.7881944444444445 | 0 |
| 0.7888888888888889 | 0 |
| 0.7895833333333333 | 0 |
| 0.7902777777777777 | 0 |
| 0.7909722222222223 | 0 |
| 0.7916666666666666 | 0 |
| 0.7923611111111111 | 0 |
| 0.7930555555555556 | 0 |
| 0.7937500000000001 | 0 |
| 0.7944444444444444 | 0 |
| 0.7951388888888888 | 0 |
| 0.7958333333333334 | 0 |
| 0.7965277777777778 | 0 |
| 0.7972222222222222 | 0 |
| 0.7979166666666666 | 0 |
| 0.7986111111111112 | 0 |
| 0.7993055555555556 | 0 |
| 0.7999999999999999 | 0 |
| 0.8006944444444444 | 0 |
| 0.8013888888888889 | 0 |
| 0.8020833333333334 | 0 |
| 0.8027777777777777 | 0 |
| 0.8034722222222223 | 0 |
| 0.8041666666666667 | 0 |
| 0.8048611111111111 | 0 |
| 0.8055555555555555 | 0 |
| 0.80625 | 0 |
| 0.8069444444444445 | 0 |
| 0.8076388888888889 | 0 |
| 0.8083333333333332 | 0 |
| 0.8090277777777778 | 0 |
| 0.8097222222222222 | 0 |
| 0.8104166666666667 | 0 |
| 0.811111111111111 | 0 |
| 0.8118055555555556 | 0 |
| 0.8125 | 0 |
| 0.8131944444444444 | 0 |
| 0.813888888888889 | 0 |
| 0.8145833333333333 | 0 |
| 0.8152777777777778 | 0 |
| 0.8159722222222222 | 0 |
| 0.8166666666666668 | 0 |
| 0.8173611111111111 | 0 |
| 0.8180555555555555 | 0 |
| 0.81875 | 0 |
| 0.8194444444444445 | 0 |
| 0.8201388888888889 | 0 |
| 0.8208333333333333 | 0 |
| 0.8215277777777777 | 0 |
| 0.8222222222222223 | 0 |
| 0.8229166666666666 | 0 |
| 0.8236111111111111 | 0 |
| 0.8243055555555556 | 0 |
| 0.8250000000000001 | 0 |
| 0.8256944444444444 | 0 |
| 0.8263888888888888 | 0 |
| 0.8270833333333334 | 0 |
| 0.8277777777777778 | 0 |
| 0.8284722222222222 | 0 |
| 0.8291666666666666 | 0 |
| 0.8298611111111112 | 0 |
| 0.8305555555555556 | 0 |
| 0.8312499999999999 | 0 |
| 0.8319444444444444 | 0 |
| 0.8326388888888889 | 0 |
| 0.8333333333333334 | 0 |
| 0.8340277777777777 | 0 |
| 0.8347222222222223 | 0 |
| 0.8354166666666667 | 0 |
| 0.8361111111111111 | 0 |
| 0.8368055555555555 | 0 |
| 0.8375 | 0 |
| 0.8381944444444445 | 0 |
| 0.8388888888888889 | 0 |
| 0.8395833333333332 | 0 |
| 0.8402777777777778 | 0 |
| 0.8409722222222222 | 0 |
| 0.8416666666666667 | 0 |
| 0.842361111111111 | 0 |
| 0.8430555555555556 | 0 |
| 0.84375 | 0 |
| 0.8444444444444444 | 0 |
| 0.845138888888889 | 0 |
| 0.8458333333333333 | 0 |
| 0.8465277777777778 | 0 |
| 0.8472222222222222 | 0 |
| 0.8479166666666668 | 0 |
| 0.8486111111111111 | 0 |
| 0.8493055555555555 | 0 |
| 0.85 | 0 |
| 0.8506944444444445 | 0 |
| 0.8513888888888889 | 0 |
| 0.8520833333333333 | 0 |
| 0.8527777777777777 | 0 |
| 0.8534722222222223 | 0 |
| 0.8541666666666666 | 0 |
| 0.8548611111111111 | 0 |
| 0.8555555555555556 | 0 |
| 0.8562500000000001 | 0 |
| 0.8569444444444444 | 0 |
| 0.8576388888888888 | 0 |
| 0.8583333333333334 | 0 |
| 0.8590277777777778 | 0 |
| 0.8597222222222222 | 0 |
| 0.8604166666666666 | 0 |
| 0.8611111111111112 | 0 |
| 0.8618055555555556 | 0 |
| 0.8624999999999999 | 0 |
| 0.8631944444444444 | 0 |
| 0.8638888888888889 | 0 |
| 0.8645833333333334 | 0 |
| 0.8652777777777777 | 0 |
| 0.8659722222222223 | 0 |
| 0.8666666666666667 | 0 |
| 0.8673611111111111 | 0 |
| 0.8680555555555555 | 0 |
| 0.86875 | 0 |
| 0.8694444444444445 | 0 |
| 0.8701388888888889 | 0 |
| 0.8708333333333332 | 0 |
| 0.8715277777777778 | 0 |
| 0.8722222222222222 | 0 |
| 0.8729166666666667 | 0 |
| 0.873611111111111 | 0 |
| 0.8743055555555556 | 0 |
| 0.875 | 0 |
| 0.8756944444444444 | 0 |
| 0.876388888888889 | 0 |
| 0.8770833333333333 | 0 |
| 0.8777777777777778 | 0 |
| 0.8784722222222222 | 0 |
| 0.8791666666666668 | 0 |
| 0.8798611111111111 | 0 |
| 0.8805555555555555 | 0 |
| 0.88125 | 0 |
| 0.8819444444444445 | 0 |
| 0.8826388888888889 | 0 |
| 0.8833333333333333 | 0 |
| 0.8840277777777777 | 0 |
| 0.8847222222222223 | 0 |
| 0.8854166666666666 | 0 |
| 0.8861111111111111 | 0 |
| 0.8868055555555556 | 0 |
| 0.8875000000000001 | 0 |
| 0.8881944444444444 | 0 |
| 0.8888888888888888 | 0 |
| 0.8895833333333334 | 0 |
| 0.8902777777777778 | 0 |
| 0.8909722222222222 | 0 |
| 0.8916666666666666 | 0 |
| 0.8923611111111112 | 0 |
| 0.8930555555555556 | 0 |
| 0.8937499999999999 | 0 |
| 0.8944444444444444 | 0 |
| 0.8951388888888889 | 0 |
| 0.8958333333333334 | 0 |
| 0.8965277777777777 | 0 |
| 0.8972222222222223 | 0 |
| 0.8979166666666667 | 0 |
| 0.8986111111111111 | 0 |
| 0.8993055555555555 | 0 |
| 0.9 | 0 |
| 0.9006944444444445 | 0 |
| 0.9013888888888889 | 0 |
| 0.9020833333333332 | 0 |
| 0.9027777777777778 | 0 |
| 0.9034722222222222 | 0 |
| 0.9041666666666667 | 0 |
| 0.904861111111111 | 0 |
| 0.9055555555555556 | 0 |
| 0.90625 | 0 |
| 0.9069444444444444 | 0 |
| 0.907638888888889 | 0 |
| 0.9083333333333333 | 0 |
| 0.9090277777777778 | 0 |
| 0.9097222222222222 | 0 |
| 0.9104166666666668 | 0 |
| 0.9111111111111111 | 0 |
| 0.9118055555555555 | 0 |
| 0.9125 | 0 |
| 0.9131944444444445 | 0 |
| 0.9138888888888889 | 0 |
| 0.9145833333333333 | 0 |
| 0.9152777777777777 | 0 |
| 0.9159722222222223 | 0 |
| 0.9166666666666666 | 0 |
| 0.9173611111111111 | 0 |
| 0.9180555555555556 | 0 |
| 0.9187500000000001 | 0 |
| 0.9194444444444444 | 0 |
| 0.9201388888888888 | 0 |
| 0.9208333333333334 | 0 |
| 0.9215277777777778 | 0 |
| 0.9222222222222222 | 0 |
| 0.9229166666666666 | 0 |
| 0.9236111111111112 | 0 |
| 0.9243055555555556 | 0 |
| 0.9249999999999999 | 0 |
| 0.9256944444444444 | 0 |
| 0.9263888888888889 | 0 |
| 0.9270833333333334 | 0 |
| 0.9277777777777777 | 0 |
| 0.9284722222222223 | 0 |
| 0.9291666666666667 | 0 |
| 0.9298611111111111 | 0 |
| 0.9305555555555555 | 0 |
| 0.93125 | 0 |
| 0.9319444444444445 | 0 |
| 0.9326388888888889 | 0 |
| 0.9333333333333332 | 0 |
| 0.9340277777777778 | 0 |
| 0.9347222222222222 | 0 |
| 0.9354166666666667 | 0 |
| 0.936111111111111 | 0 |
| 0.9368055555555556 | 0 |
| 0.9375 | 0 |
| 0.9381944444444444 | 0 |
| 0.938888888888889 | 0 |
| 0.9395833333333333 | 0 |
| 0.9402777777777778 | 0 |
| 0.9409722222222222 | 0 |
| 0.9416666666666668 | 0 |
| 0.9423611111111111 | 0 |
| 0.9430555555555555 | 0 |
| 0.94375 | 0 |
| 0.9444444444444445 | 0 |
| 0.9451388888888889 | 0 |
| 0.9458333333333333 | 0 |
| 0.9465277777777777 | 0 |
| 0.9472222222222223 | 0 |
| 0.9479166666666666 | 0 |
| 0.9486111111111111 | 0 |
| 0.9493055555555556 | 0 |
| 0.9500000000000001 | 0 |
| 0.9506944444444444 | 0 |
| 0.9513888888888888 | 0 |
| 0.9520833333333334 | 0 |
| 0.9527777777777778 | 0 |
| 0.9534722222222222 | 0 |
| 0.9541666666666666 | 0 |
| 0.9548611111111112 | 0 |
| 0.9555555555555556 | 0 |
| 0.9562499999999999 | 0 |
| 0.9569444444444444 | 0 |
| 0.9576388888888889 | 0 |
| 0.9583333333333334 | 0 |
| 0.9590277777777777 | 0 |
| 0.9597222222222223 | 0 |
| 0.9604166666666667 | 0 |
| 0.9611111111111111 | 0 |
| 0.9618055555555555 | 0 |
| 0.9625 | 0 |
| 0.9631944444444445 | 0 |
| 0.9638888888888889 | 0 |
| 0.9645833333333332 | 0 |
| 0.9652777777777778 | 0 |
| 0.9659722222222222 | 0 |
| 0.9666666666666667 | 0 |
| 0.967361111111111 | 0 |
| 0.9680555555555556 | 0 |
| 0.96875 | 0 |
| 0.9694444444444444 | 0 |
| 0.970138888888889 | 0 |
| 0.9708333333333333 | 0 |
| 0.9715277777777778 | 0 |
| 0.9722222222222222 | 0 |
| 0.9729166666666668 | 0 |
| 0.9736111111111111 | 0 |
| 0.9743055555555555 | 0 |
| 0.975 | 0 |
| 0.9756944444444445 | 0 |
| 0.9763888888888889 | 0 |
| 0.9770833333333333 | 0 |
| 0.9777777777777777 | 0 |
| 0.9784722222222223 | 0 |
| 0.9791666666666666 | 0 |
| 0.9798611111111111 | 0 |
| 0.9805555555555556 | 0 |
| 0.9812500000000001 | 0 |
| 0.9819444444444444 | 0 |
| 0.9826388888888888 | 0 |
| 0.9833333333333334 | 0 |
| 0.9840277777777778 | 0 |
| 0.9847222222222222 | 0 |
| 0.9854166666666666 | 0 |
| 0.9861111111111112 | 0 |
| 0.9868055555555556 | 0 |
| 0.9874999999999999 | 0 |
| 0.9881944444444444 | 0 |
| 0.9888888888888889 | 0 |
| 0.9895833333333334 | 0 |
| 0.9902777777777777 | 0 |
| 0.9909722222222223 | 0 |
| 0.9916666666666667 | 0 |
| 0.9923611111111111 | 0 |
| 0.9930555555555555 | 0 |
| 0.99375 | 0 |
| 0.9944444444444445 | 0 |
| 0.9951388888888889 | 0 |
| 0.9958333333333332 | 0 |
| 0.9965277777777778 | 0 |
| 0.9972222222222222 | 0 |
| 0.9979166666666667 | 0 |
| 0.998611111111111 | 0 |
| 0.9993055555555556 | 0 |